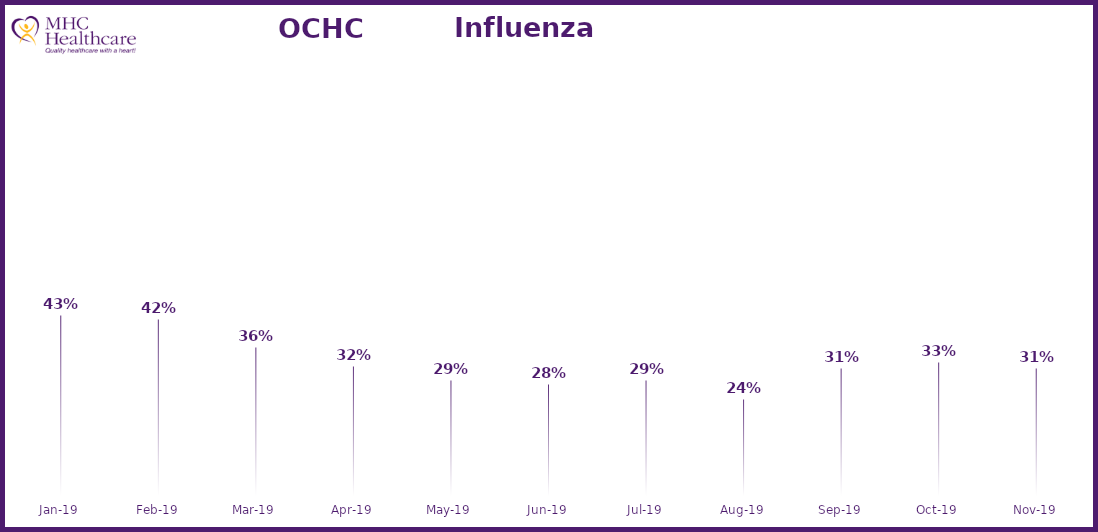
| Category | Online Access to Health Information |
|---|---|
| 2019-01-01 | 0.431 |
| 2019-02-01 | 0.424 |
| 2019-03-01 | 0.361 |
| 2019-04-01 | 0.317 |
| 2019-05-01 | 0.285 |
| 2019-06-01 | 0.276 |
| 2019-07-01 | 0.287 |
| 2019-08-01 | 0.243 |
| 2019-09-01 | 0.312 |
| 2019-10-01 | 0.327 |
| 2019-11-01 | 0.314 |